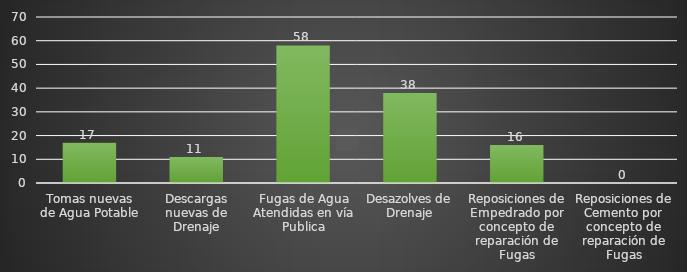
| Category | INDICADOR  |
|---|---|
| Tomas nuevas de Agua Potable | 17 |
| Descargas nuevas de Drenaje | 11 |
| Fugas de Agua Atendidas en vía Publica | 58 |
| Desazolves de Drenaje | 38 |
| Reposiciones de Empedrado por concepto de reparación de Fugas | 16 |
| Reposiciones de Cemento por concepto de reparación de Fugas | 0 |